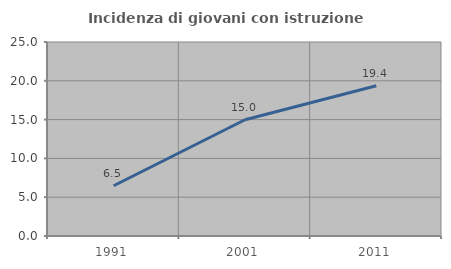
| Category | Incidenza di giovani con istruzione universitaria |
|---|---|
| 1991.0 | 6.478 |
| 2001.0 | 14.98 |
| 2011.0 | 19.355 |